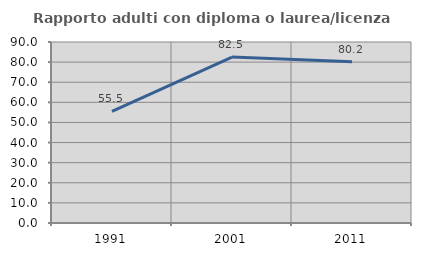
| Category | Rapporto adulti con diploma o laurea/licenza media  |
|---|---|
| 1991.0 | 55.494 |
| 2001.0 | 82.536 |
| 2011.0 | 80.178 |